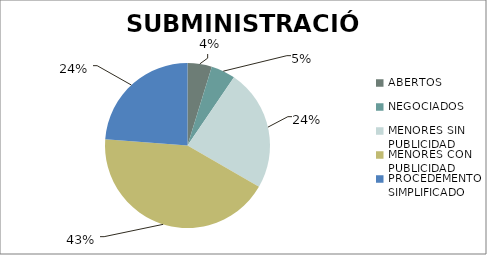
| Category | Series 0 |
|---|---|
| ABERTOS  | 1 |
| NEGOCIADOS  | 1 |
| MENORES SIN PUBLICIDAD | 5 |
| MENORES CON PUBLICIDAD | 9 |
| PROCEDEMENTO SIMPLIFICADO | 5 |